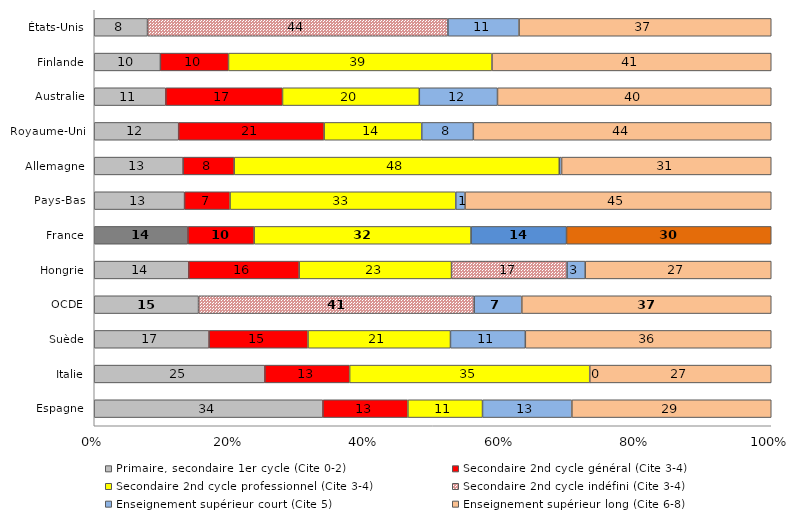
| Category | Primaire, secondaire 1er cycle (Cite 0-2) | Secondaire 2nd cycle général (Cite 3-4) | Secondaire 2nd cycle professionnel (Cite 3-4) | Secondaire 2nd cycle indéfini (Cite 3-4) | Enseignement supérieur court (Cite 5) | Enseignement supérieur long (Cite 6-8) |
|---|---|---|---|---|---|---|
| Espagne | 33.78 | 12.55 | 11.02 | 0 | 13.2 | 29.45 |
| Italie | 25.2 | 12.52 | 35.46 | 0 | 0.01 | 26.8 |
| Suède | 16.96 | 14.61 | 21.04 | 0 | 11.06 | 36.32 |
| OCDE | 15.48 | 0 | 0 | 40.9 | 7.07 | 37.02 |
| Hongrie | 13.96 | 16.31 | 22.5 | 17.07 | 2.68 | 27.48 |
| France | 13.84 | 9.78 | 32.04 | 0 | 14.1 | 30.24 |
| Pays-Bas | 13.34 | 6.72 | 33.34 | 0 | 1.37 | 45.23 |
| Allemagne | 13.13 | 7.54 | 48.02 | 0 | 0.34 | 30.97 |
| Royaume-Uni | 12.47 | 21.49 | 14.42 | 0 | 7.62 | 44.01 |
| Australie | 10.57 | 17.24 | 20.21 | 0 | 11.55 | 40.44 |
| Finlande | 9.77 | 10.06 | 38.92 | 0 | 0 | 41.25 |
| États-Unis | 7.87 | 0 | 0 | 44.37 | 10.51 | 37.25 |